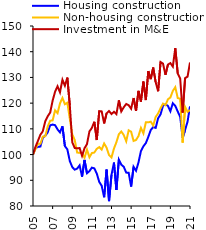
| Category | Housing construction | Non-housing construction | Investment in M&E |
|---|---|---|---|
| 2005-03-31 | 100 | 100 | 100 |
| 2005-06-30 | 102.475 | 102.125 | 102.989 |
| 2005-09-30 | 102.969 | 104.174 | 105.292 |
| 2005-12-31 | 103.113 | 104.162 | 107.699 |
| 2006-03-31 | 106.515 | 106.943 | 109.069 |
| 2006-06-30 | 107.371 | 107.147 | 112.962 |
| 2006-09-30 | 108.635 | 110.898 | 114.89 |
| 2006-12-31 | 111.39 | 113.16 | 116.325 |
| 2007-03-31 | 111.659 | 113.289 | 120.958 |
| 2007-06-30 | 111.438 | 117.209 | 124.445 |
| 2007-09-30 | 109.802 | 116.11 | 126.562 |
| 2007-12-31 | 108.617 | 119.923 | 124.214 |
| 2008-03-31 | 111.002 | 122.006 | 129.105 |
| 2008-06-30 | 103.277 | 119.569 | 126.775 |
| 2008-09-30 | 102.012 | 120.154 | 129.935 |
| 2008-12-31 | 97.499 | 113.963 | 119.18 |
| 2009-03-31 | 95.138 | 107.885 | 104.777 |
| 2009-06-30 | 94.125 | 105.681 | 102.562 |
| 2009-09-30 | 94.539 | 100.783 | 102.419 |
| 2009-12-31 | 95.8 | 100.691 | 102.549 |
| 2010-03-31 | 91.426 | 100.447 | 99.52 |
| 2010-06-30 | 97.926 | 98.771 | 102.458 |
| 2010-09-30 | 92.742 | 101.94 | 104.06 |
| 2010-12-31 | 93.549 | 98.95 | 108.985 |
| 2011-03-31 | 94.925 | 100.588 | 110.377 |
| 2011-06-30 | 94.632 | 100.801 | 112.761 |
| 2011-09-30 | 92.616 | 102.235 | 105.651 |
| 2011-12-31 | 89.372 | 102.896 | 116.905 |
| 2012-03-31 | 87.873 | 101.936 | 116.803 |
| 2012-06-30 | 83.406 | 104.301 | 112.105 |
| 2012-09-30 | 94.171 | 102.668 | 116.045 |
| 2012-12-31 | 81.903 | 99.796 | 116.917 |
| 2013-03-31 | 92.127 | 98.887 | 115.763 |
| 2013-06-30 | 96.883 | 102.334 | 116.636 |
| 2013-09-30 | 86.209 | 104.814 | 115.746 |
| 2013-12-31 | 98.016 | 107.896 | 121.079 |
| 2014-03-31 | 96.064 | 108.982 | 116.787 |
| 2014-06-30 | 95.239 | 107.584 | 118.401 |
| 2014-09-30 | 92.983 | 105.163 | 119.663 |
| 2014-12-31 | 92.921 | 109.432 | 119.206 |
| 2015-03-31 | 87.56 | 108.895 | 117.829 |
| 2015-06-30 | 95.239 | 105.308 | 122.002 |
| 2015-09-30 | 93.716 | 105.657 | 116.995 |
| 2015-12-31 | 96.94 | 107.215 | 124.778 |
| 2016-03-31 | 101.353 | 110.348 | 120.601 |
| 2016-06-30 | 103.195 | 108.252 | 128.4 |
| 2016-09-30 | 104.474 | 112.544 | 121.197 |
| 2016-12-31 | 106.865 | 112.537 | 132.479 |
| 2017-03-31 | 109.537 | 112.805 | 129.328 |
| 2017-06-30 | 110.708 | 111.301 | 133.848 |
| 2017-09-30 | 110.373 | 114.624 | 128.175 |
| 2017-12-31 | 114.101 | 116 | 124.64 |
| 2018-03-31 | 115.644 | 118.044 | 136.017 |
| 2018-06-30 | 118.996 | 119.81 | 135.375 |
| 2018-09-30 | 119.569 | 119.216 | 131.011 |
| 2018-12-31 | 118.943 | 121.49 | 134.996 |
| 2019-03-31 | 116.843 | 122.204 | 135.572 |
| 2019-06-30 | 119.958 | 124.757 | 134.213 |
| 2019-09-30 | 118.937 | 126.201 | 141.414 |
| 2019-12-31 | 116.74 | 121.977 | 131.503 |
| 2020-03-31 | 114.664 | 121.721 | 129.577 |
| 2020-06-30 | 106.502 | 104.651 | 116.326 |
| 2020-09-30 | 109.579 | 118.506 | 129.716 |
| 2020-12-31 | 112.796 | 116.585 | 130.281 |
| 2021-03-31 | 118.779 | 117.3 | 135.803 |